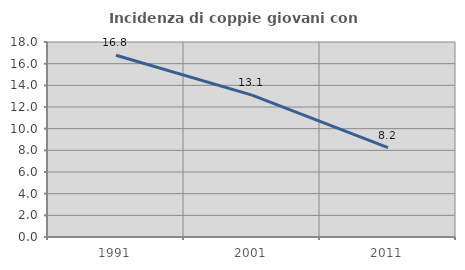
| Category | Incidenza di coppie giovani con figli |
|---|---|
| 1991.0 | 16.773 |
| 2001.0 | 13.101 |
| 2011.0 | 8.243 |